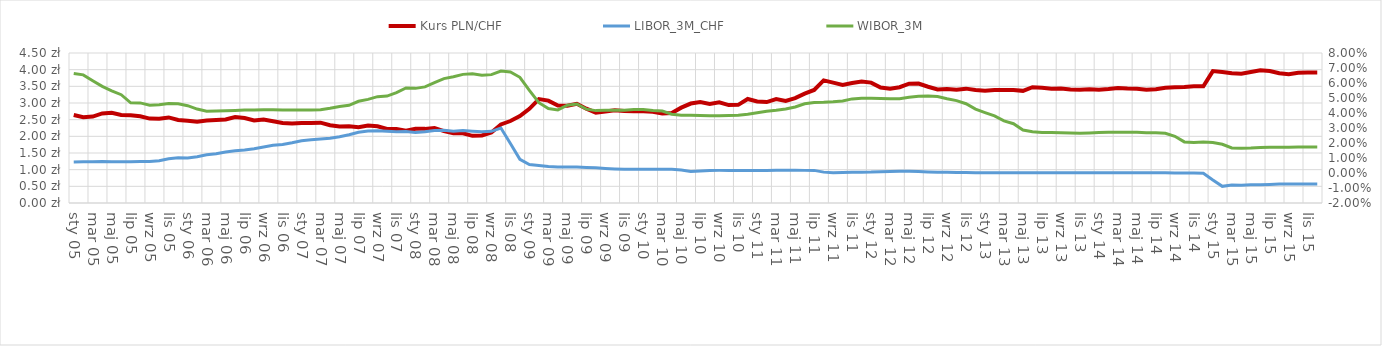
| Category | Kurs PLN/CHF |
|---|---|
| 2005-01-01 | 2.639 |
| 2005-02-01 | 2.571 |
| 2005-03-01 | 2.593 |
| 2005-04-01 | 2.686 |
| 2005-05-01 | 2.705 |
| 2005-06-01 | 2.639 |
| 2005-07-01 | 2.631 |
| 2005-08-01 | 2.604 |
| 2005-09-01 | 2.531 |
| 2005-10-01 | 2.531 |
| 2005-11-01 | 2.567 |
| 2005-12-01 | 2.489 |
| 2006-01-01 | 2.467 |
| 2006-02-01 | 2.436 |
| 2006-03-01 | 2.473 |
| 2006-04-01 | 2.488 |
| 2006-05-01 | 2.505 |
| 2006-06-01 | 2.577 |
| 2006-07-01 | 2.548 |
| 2006-08-01 | 2.475 |
| 2006-09-01 | 2.506 |
| 2006-10-01 | 2.455 |
| 2006-11-01 | 2.402 |
| 2006-12-01 | 2.387 |
| 2007-01-01 | 2.4 |
| 2007-02-01 | 2.402 |
| 2007-03-01 | 2.41 |
| 2007-04-01 | 2.332 |
| 2007-05-01 | 2.292 |
| 2007-06-01 | 2.3 |
| 2007-07-01 | 2.274 |
| 2007-08-01 | 2.327 |
| 2007-09-01 | 2.3 |
| 2007-10-01 | 2.219 |
| 2007-11-01 | 2.22 |
| 2007-12-01 | 2.171 |
| 2008-01-01 | 2.228 |
| 2008-02-01 | 2.224 |
| 2008-03-01 | 2.252 |
| 2008-04-01 | 2.159 |
| 2008-05-01 | 2.095 |
| 2008-06-01 | 2.091 |
| 2008-07-01 | 2.015 |
| 2008-08-01 | 2.028 |
| 2008-09-01 | 2.116 |
| 2008-10-01 | 2.356 |
| 2008-11-01 | 2.459 |
| 2008-12-01 | 2.606 |
| 2009-01-01 | 2.826 |
| 2009-02-01 | 3.119 |
| 2009-03-01 | 3.072 |
| 2009-04-01 | 2.924 |
| 2009-05-01 | 2.916 |
| 2009-06-01 | 2.977 |
| 2009-07-01 | 2.829 |
| 2009-08-01 | 2.71 |
| 2009-09-01 | 2.748 |
| 2009-10-01 | 2.783 |
| 2009-11-01 | 2.76 |
| 2009-12-01 | 2.756 |
| 2010-01-01 | 2.755 |
| 2010-02-01 | 2.735 |
| 2010-03-01 | 2.688 |
| 2010-04-01 | 2.702 |
| 2010-05-01 | 2.86 |
| 2010-06-01 | 2.984 |
| 2010-07-01 | 3.029 |
| 2010-08-01 | 2.972 |
| 2010-09-01 | 3.022 |
| 2010-10-01 | 2.937 |
| 2010-11-01 | 2.943 |
| 2010-12-01 | 3.12 |
| 2011-01-01 | 3.046 |
| 2011-02-01 | 3.029 |
| 2011-03-01 | 3.116 |
| 2011-04-01 | 3.061 |
| 2011-05-01 | 3.145 |
| 2011-06-01 | 3.279 |
| 2011-07-01 | 3.391 |
| 2011-08-01 | 3.677 |
| 2011-09-01 | 3.61 |
| 2011-10-01 | 3.541 |
| 2011-11-01 | 3.598 |
| 2011-12-01 | 3.646 |
| 2012-01-01 | 3.611 |
| 2012-02-01 | 3.465 |
| 2012-03-01 | 3.43 |
| 2012-04-01 | 3.475 |
| 2012-05-01 | 3.58 |
| 2012-06-01 | 3.582 |
| 2012-07-01 | 3.488 |
| 2012-08-01 | 3.408 |
| 2012-09-01 | 3.421 |
| 2012-10-01 | 3.397 |
| 2012-11-01 | 3.431 |
| 2012-12-01 | 3.387 |
| 2013-01-01 | 3.369 |
| 2013-02-01 | 3.392 |
| 2013-03-01 | 3.389 |
| 2013-04-01 | 3.392 |
| 2013-05-01 | 3.364 |
| 2013-06-01 | 3.475 |
| 2013-07-01 | 3.459 |
| 2013-08-01 | 3.431 |
| 2013-09-01 | 3.433 |
| 2013-10-01 | 3.403 |
| 2013-11-01 | 3.401 |
| 2013-12-01 | 3.411 |
| 2014-01-01 | 3.395 |
| 2014-02-01 | 3.419 |
| 2014-03-01 | 3.45 |
| 2014-04-01 | 3.433 |
| 2014-05-01 | 3.424 |
| 2014-06-01 | 3.395 |
| 2014-07-01 | 3.411 |
| 2014-08-01 | 3.459 |
| 2014-09-01 | 3.47 |
| 2014-10-01 | 3.482 |
| 2014-11-01 | 3.502 |
| 2014-12-01 | 3.504 |
| 2015-01-01 | 3.958 |
| 2015-02-01 | 3.933 |
| 2015-03-01 | 3.89 |
| 2015-04-01 | 3.877 |
| 2015-05-01 | 3.927 |
| 2015-06-01 | 3.984 |
| 2015-07-01 | 3.962 |
| 2015-08-01 | 3.891 |
| 2015-09-01 | 3.863 |
| 2015-10-01 | 3.906 |
| 2015-11-01 | 3.914 |
| 2015-12-01 | 3.914 |